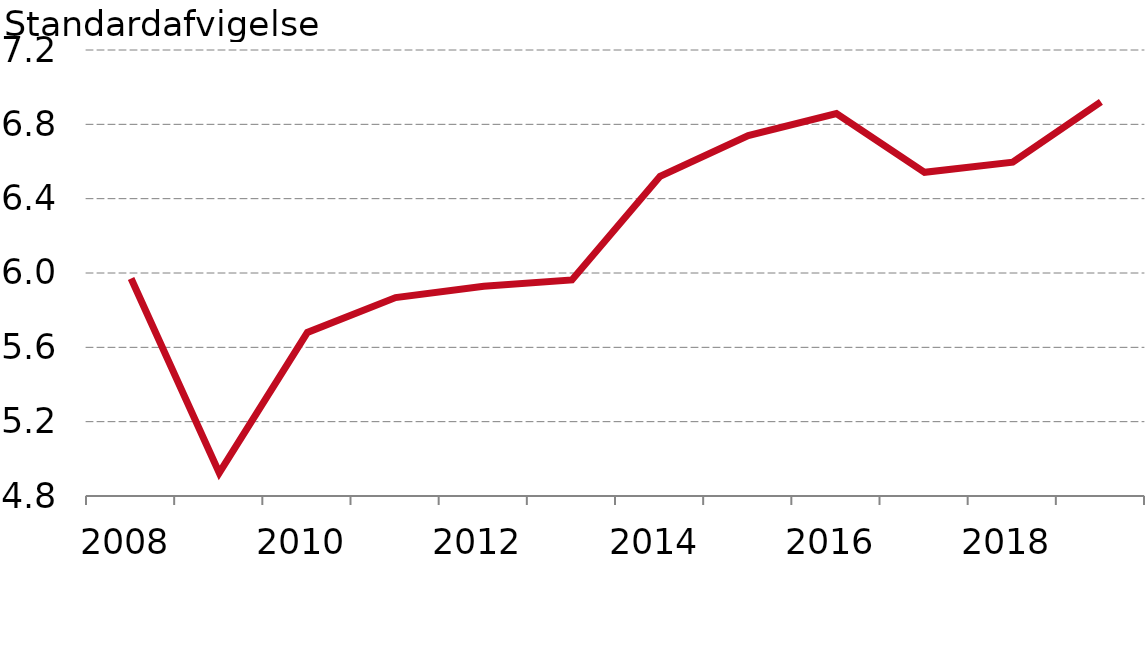
| Category |  Standardafvigelse |
|---|---|
| 2008.0 | 5.97 |
| 2009.0 | 4.924 |
| 2010.0 | 5.68 |
| 2011.0 | 5.868 |
| 2012.0 | 5.928 |
| 2013.0 | 5.962 |
| 2014.0 | 6.52 |
| 2015.0 | 6.74 |
| 2016.0 | 6.858 |
| 2017.0 | 6.542 |
| 2018.0 | 6.596 |
| 2019.0 | 6.921 |